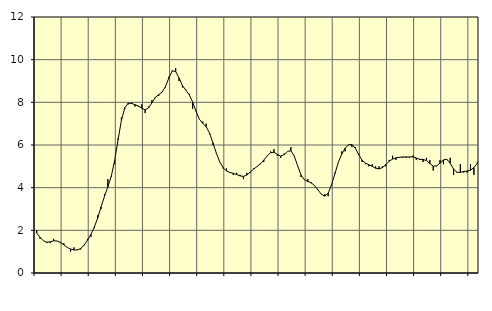
| Category | Piggar | Series 1 |
|---|---|---|
| nan | 2 | 1.87 |
| 87.0 | 1.6 | 1.67 |
| 87.0 | 1.5 | 1.51 |
| 87.0 | 1.4 | 1.44 |
| nan | 1.4 | 1.46 |
| 88.0 | 1.6 | 1.51 |
| 88.0 | 1.5 | 1.5 |
| 88.0 | 1.4 | 1.44 |
| nan | 1.4 | 1.32 |
| 89.0 | 1.2 | 1.2 |
| 89.0 | 1 | 1.12 |
| 89.0 | 1.2 | 1.08 |
| nan | 1.1 | 1.08 |
| 90.0 | 1.1 | 1.15 |
| 90.0 | 1.3 | 1.31 |
| 90.0 | 1.6 | 1.54 |
| nan | 1.7 | 1.81 |
| 91.0 | 2.1 | 2.15 |
| 91.0 | 2.7 | 2.58 |
| 91.0 | 3 | 3.1 |
| nan | 3.7 | 3.59 |
| 92.0 | 4.4 | 4.04 |
| 92.0 | 4.5 | 4.53 |
| 92.0 | 5.1 | 5.27 |
| nan | 6.3 | 6.24 |
| 93.0 | 7.3 | 7.16 |
| 93.0 | 7.7 | 7.75 |
| 93.0 | 7.9 | 7.96 |
| nan | 8 | 7.95 |
| 94.0 | 7.8 | 7.89 |
| 94.0 | 7.8 | 7.83 |
| 94.0 | 7.9 | 7.72 |
| nan | 7.5 | 7.65 |
| 95.0 | 7.8 | 7.74 |
| 95.0 | 8.1 | 7.98 |
| 95.0 | 8.2 | 8.23 |
| nan | 8.3 | 8.36 |
| 96.0 | 8.5 | 8.48 |
| 96.0 | 8.7 | 8.74 |
| 96.0 | 9.2 | 9.14 |
| nan | 9.5 | 9.47 |
| 97.0 | 9.6 | 9.45 |
| 97.0 | 9 | 9.14 |
| 97.0 | 8.7 | 8.79 |
| nan | 8.6 | 8.57 |
| 98.0 | 8.4 | 8.36 |
| 98.0 | 7.7 | 8.02 |
| 98.0 | 7.6 | 7.58 |
| nan | 7.2 | 7.21 |
| 99.0 | 7.1 | 7.01 |
| 99.0 | 7 | 6.86 |
| 99.0 | 6.5 | 6.56 |
| nan | 6 | 6.1 |
| 0.0 | 5.6 | 5.62 |
| 0.0 | 5.2 | 5.21 |
| 0.0 | 4.9 | 4.94 |
| nan | 4.9 | 4.78 |
| 1.0 | 4.7 | 4.71 |
| 1.0 | 4.6 | 4.67 |
| 1.0 | 4.7 | 4.62 |
| nan | 4.6 | 4.55 |
| 2.0 | 4.4 | 4.53 |
| 2.0 | 4.7 | 4.59 |
| 2.0 | 4.7 | 4.73 |
| nan | 4.9 | 4.87 |
| 3.0 | 5 | 4.99 |
| 3.0 | 5.1 | 5.12 |
| 3.0 | 5.2 | 5.29 |
| nan | 5.5 | 5.49 |
| 4.0 | 5.7 | 5.64 |
| 4.0 | 5.8 | 5.66 |
| 4.0 | 5.5 | 5.56 |
| nan | 5.4 | 5.48 |
| 5.0 | 5.6 | 5.55 |
| 5.0 | 5.7 | 5.7 |
| 5.0 | 5.9 | 5.73 |
| nan | 5.5 | 5.48 |
| 6.0 | 5 | 5.02 |
| 6.0 | 4.5 | 4.59 |
| 6.0 | 4.4 | 4.37 |
| nan | 4.4 | 4.29 |
| 7.0 | 4.2 | 4.23 |
| 7.0 | 4.1 | 4.09 |
| 7.0 | 3.9 | 3.89 |
| nan | 3.7 | 3.69 |
| 8.0 | 3.7 | 3.6 |
| 8.0 | 3.6 | 3.74 |
| 8.0 | 4.1 | 4.14 |
| nan | 4.7 | 4.66 |
| 9.0 | 5.2 | 5.19 |
| 9.0 | 5.7 | 5.57 |
| 9.0 | 5.7 | 5.85 |
| nan | 6 | 6.01 |
| 10.0 | 5.9 | 6.02 |
| 10.0 | 5.9 | 5.85 |
| 10.0 | 5.6 | 5.55 |
| nan | 5.2 | 5.29 |
| 11.0 | 5.1 | 5.15 |
| 11.0 | 5 | 5.08 |
| 11.0 | 5.1 | 5 |
| nan | 5 | 4.91 |
| 12.0 | 5 | 4.88 |
| 12.0 | 5 | 4.94 |
| 12.0 | 5 | 5.08 |
| nan | 5.3 | 5.24 |
| 13.0 | 5.5 | 5.34 |
| 13.0 | 5.3 | 5.4 |
| 13.0 | 5.4 | 5.42 |
| nan | 5.4 | 5.44 |
| 14.0 | 5.4 | 5.44 |
| 14.0 | 5.4 | 5.44 |
| 14.0 | 5.5 | 5.44 |
| nan | 5.3 | 5.39 |
| 15.0 | 5.3 | 5.33 |
| 15.0 | 5.2 | 5.32 |
| 15.0 | 5.4 | 5.27 |
| nan | 5.3 | 5.13 |
| 16.0 | 4.8 | 5.01 |
| 16.0 | 5 | 5.02 |
| 16.0 | 5.3 | 5.15 |
| nan | 5.1 | 5.3 |
| 17.0 | 5.3 | 5.33 |
| 17.0 | 5.4 | 5.14 |
| 17.0 | 4.6 | 4.87 |
| nan | 4.7 | 4.72 |
| 18.0 | 5.1 | 4.72 |
| 18.0 | 4.7 | 4.76 |
| 18.0 | 4.7 | 4.78 |
| nan | 5.1 | 4.82 |
| 19.0 | 4.6 | 4.94 |
| 19.0 | 5.2 | 5.14 |